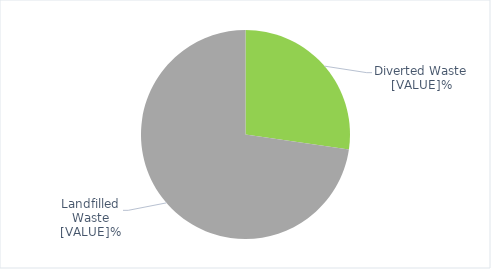
| Category | Series 0 |
|---|---|
| 0 | 27.3 |
| 1 | 72.7 |